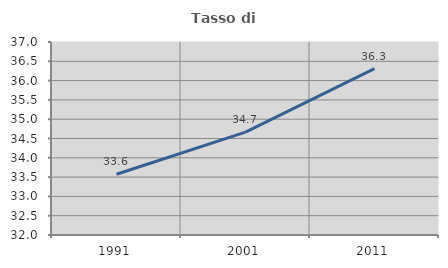
| Category | Tasso di occupazione   |
|---|---|
| 1991.0 | 33.573 |
| 2001.0 | 34.665 |
| 2011.0 | 36.31 |